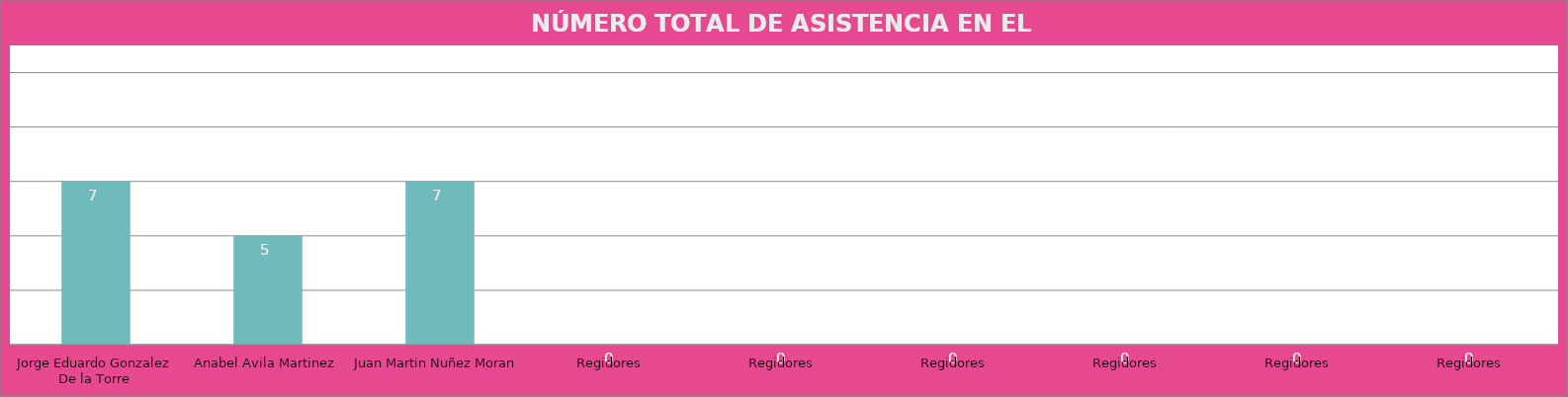
| Category | Jorge Eduardo Gonzalez De la Torre |
|---|---|
| Jorge Eduardo Gonzalez De la Torre | 7 |
| Anabel Avila Martinez | 5 |
| Juan Martin Nuñez Moran | 7 |
| Regidores | 0 |
| Regidores | 0 |
| Regidores | 0 |
| Regidores | 0 |
| Regidores | 0 |
| Regidores | 0 |